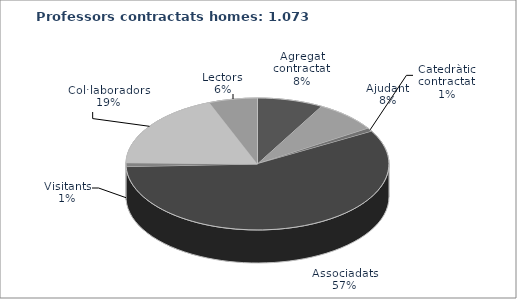
| Category | Agregada/at contractada/at Ajudant/a Catedràtic/a contractat Associades/ats Visitants Col·laboradores/ors  Lectors |
|---|---|
| Agregada/at contractada/at | 87 |
| Ajudant/a | 84 |
| Catedràtic/a contractat | 9 |
| Associades/ats | 618 |
| Visitants | 10 |
| Col·laboradores/ors  | 201 |
| Lectors | 64 |